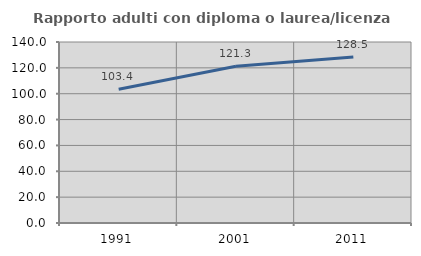
| Category | Rapporto adulti con diploma o laurea/licenza media  |
|---|---|
| 1991.0 | 103.429 |
| 2001.0 | 121.285 |
| 2011.0 | 128.472 |